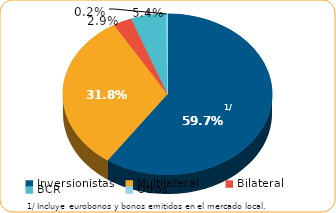
| Category | Series 0 |
|---|---|
| Inversionistas | 7751.8 |
| Multilateral | 4136.6 |
| Bilateral | 370.8 |
| BCR | 704.3 |
| Otros | 31.4 |